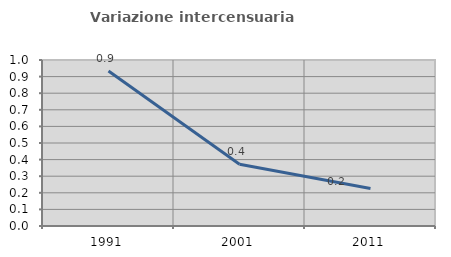
| Category | Variazione intercensuaria annua |
|---|---|
| 1991.0 | 0.933 |
| 2001.0 | 0.372 |
| 2011.0 | 0.226 |